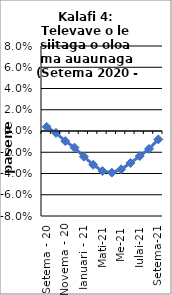
| Category | All items - 12 month rolling year average changes |
|---|---|
| Setema - 20 | 0.004 |
| Oketopa - 20 | -0.002 |
| Novema - 20 | -0.009 |
| Tesema - 20 | -0.016 |
| Ianuari - 21 | -0.024 |
| Fepuari -21 | -0.032 |
| Mati-21 | -0.038 |
| Aperila -21 | -0.039 |
| Me-21 | -0.036 |
| Iuni-21 | -0.03 |
| Iulai-21 | -0.024 |
| Aukuso-21 | -0.017 |
| Setema-21 | -0.008 |